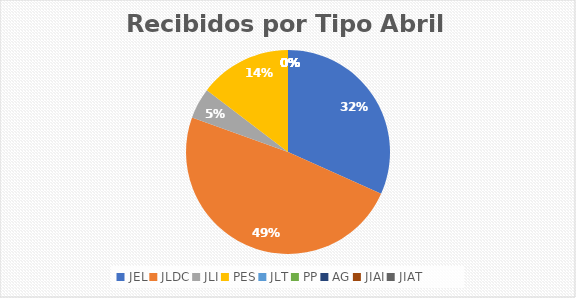
| Category | Series 0 |
|---|---|
| JEL | 13 |
| JLDC | 20 |
| JLI | 2 |
| PES | 6 |
| JLT | 0 |
| PP | 0 |
| AG | 0 |
| JIAI | 0 |
| JIAT | 0 |